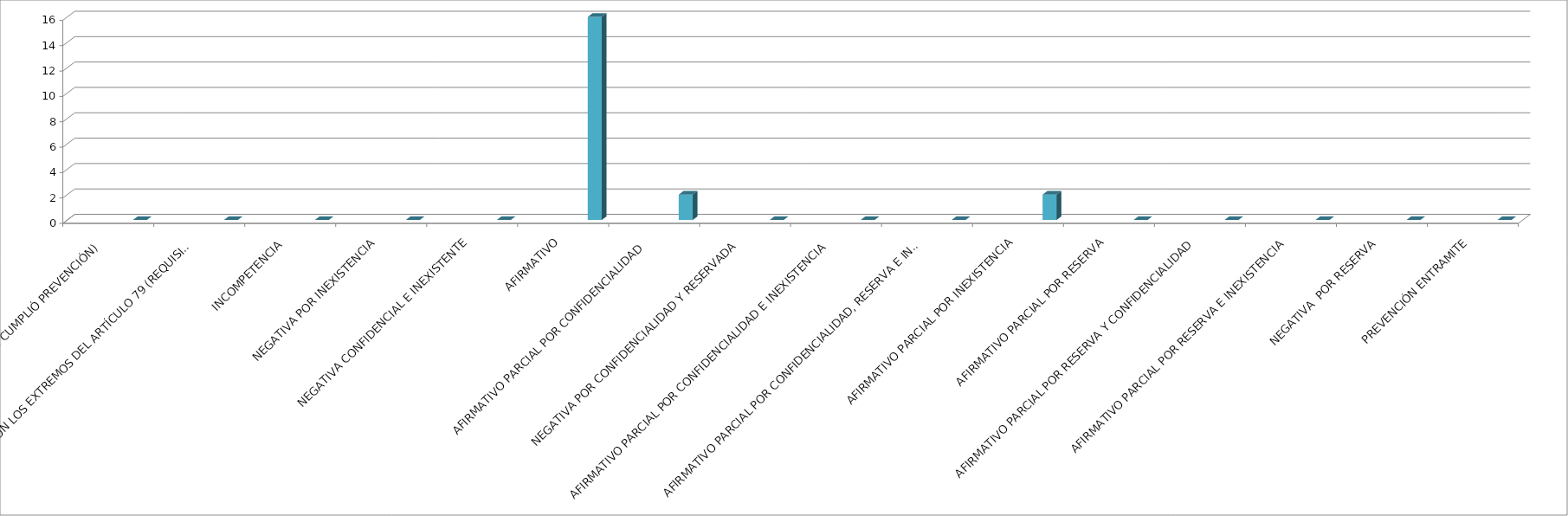
| Category | Series 0 | Series 1 | Series 2 | Series 3 | Series 4 |
|---|---|---|---|---|---|
| SE TIENE POR NO PRESENTADA ( NO CUMPLIÓ PREVENCIÓN) |  |  |  |  | 0 |
| NO CUMPLIO CON LOS EXTREMOS DEL ARTÍCULO 79 (REQUISITOS) |  |  |  |  | 0 |
| INCOMPETENCIA  |  |  |  |  | 0 |
| NEGATIVA POR INEXISTENCIA |  |  |  |  | 0 |
| NEGATIVA CONFIDENCIAL E INEXISTENTE |  |  |  |  | 0 |
| AFIRMATIVO |  |  |  |  | 16 |
| AFIRMATIVO PARCIAL POR CONFIDENCIALIDAD  |  |  |  |  | 2 |
| NEGATIVA POR CONFIDENCIALIDAD Y RESERVADA |  |  |  |  | 0 |
| AFIRMATIVO PARCIAL POR CONFIDENCIALIDAD E INEXISTENCIA |  |  |  |  | 0 |
| AFIRMATIVO PARCIAL POR CONFIDENCIALIDAD, RESERVA E INEXISTENCIA |  |  |  |  | 0 |
| AFIRMATIVO PARCIAL POR INEXISTENCIA |  |  |  |  | 2 |
| AFIRMATIVO PARCIAL POR RESERVA |  |  |  |  | 0 |
| AFIRMATIVO PARCIAL POR RESERVA Y CONFIDENCIALIDAD |  |  |  |  | 0 |
| AFIRMATIVO PARCIAL POR RESERVA E INEXISTENCIA |  |  |  |  | 0 |
| NEGATIVA  POR RESERVA |  |  |  |  | 0 |
| PREVENCIÓN ENTRAMITE |  |  |  |  | 0 |